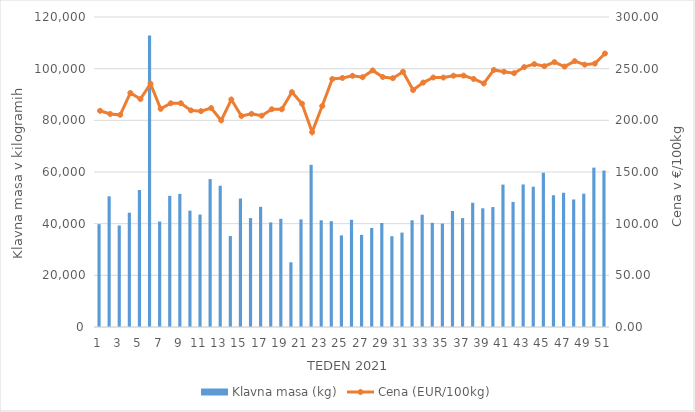
| Category | Klavna masa (kg) |
|---|---|
| 1.0 | 39814 |
| 2.0 | 50603 |
| 3.0 | 39295 |
| 4.0 | 44250 |
| 5.0 | 53061 |
| 6.0 | 112816 |
| 7.0 | 40829 |
| 8.0 | 50775 |
| 9.0 | 51535 |
| 10.0 | 45040 |
| 11.0 | 43536 |
| 12.0 | 57246 |
| 13.0 | 54680 |
| 14.0 | 35237 |
| 15.0 | 49721 |
| 16.0 | 42177 |
| 17.0 | 46525 |
| 18.0 | 40491 |
| 19.0 | 41888 |
| 20.0 | 25048 |
| 21.0 | 41651 |
| 22.0 | 62774 |
| 23.0 | 41297 |
| 24.0 | 40971 |
| 25.0 | 35465 |
| 26.0 | 41489 |
| 27.0 | 35675 |
| 28.0 | 38316 |
| 29.0 | 40265 |
| 30.0 | 35146 |
| 31.0 | 36548 |
| 32.0 | 41314 |
| 33.0 | 43471 |
| 34.0 | 40333 |
| 35.0 | 40041 |
| 36.0 | 44895 |
| 37.0 | 42158 |
| 38.0 | 48077 |
| 39.0 | 45950 |
| 40.0 | 46433 |
| 41.0 | 55121 |
| 42.0 | 48414 |
| 43.0 | 55179 |
| 44.0 | 54294 |
| 45.0 | 59707 |
| 46.0 | 51007 |
| 47.0 | 52010 |
| 48.0 | 49369 |
| 49.0 | 51594 |
| 50.0 | 61693 |
| 51.0 | 60557 |